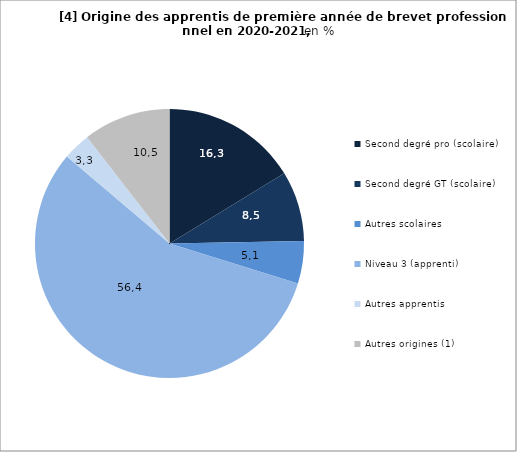
| Category | Series 0 |
|---|---|
| Second degré pro (scolaire) | 16.262 |
| Second degré GT (scolaire) | 8.454 |
| Autres scolaires | 5.084 |
| Niveau 3 (apprenti) | 56.388 |
| Autres apprentis | 3.316 |
| Autres origines (1) | 10.496 |